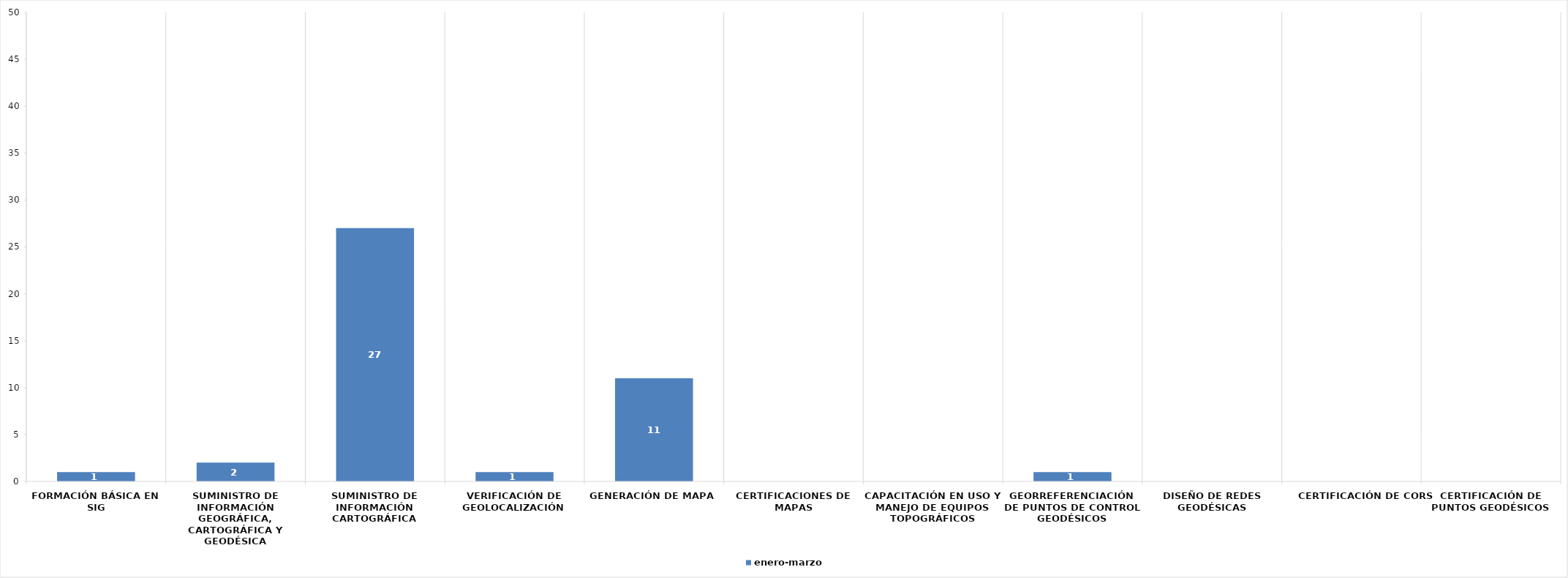
| Category | enero-marzo |
|---|---|
| Formación básica en SIG | 1 |
| Suministro de información geográfica, cartográfica y geodésica | 2 |
| Suministro de información cartográfica | 27 |
| Verificación de geolocalización | 1 |
| Generación de mapa | 11 |
| Certificaciones de mapas | 0 |
| Capacitación en uso y manejo de equipos topográficos | 0 |
| Georreferenciación de puntos de control geodésicos | 1 |
| Diseño de Redes Geodésicas | 0 |
| Certificación de CORS | 0 |
| Certificación de puntos geodésicos | 0 |